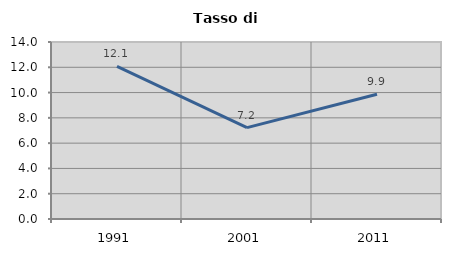
| Category | Tasso di disoccupazione   |
|---|---|
| 1991.0 | 12.077 |
| 2001.0 | 7.224 |
| 2011.0 | 9.865 |